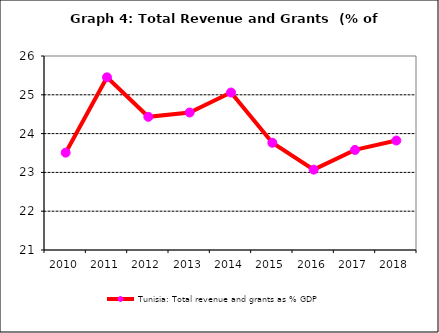
| Category | Tunisia: Total revenue and grants as % GDP |
|---|---|
| 2010.0 | 23.509 |
| 2011.0 | 25.45 |
| 2012.0 | 24.433 |
| 2013.0 | 24.544 |
| 2014.0 | 25.059 |
| 2015.0 | 23.764 |
| 2016.0 | 23.07 |
| 2017.0 | 23.579 |
| 2018.0 | 23.821 |